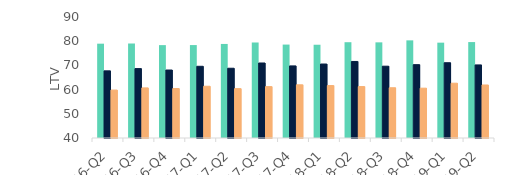
| Category | First-time
buyers | Homemovers | Homowner remortgaging |
|---|---|---|---|
| 16-Q2 | 78.977 | 67.747 | 59.804 |
| 16-Q3 | 79.048 | 68.681 | 60.7 |
| 16-Q4 | 78.38 | 68.092 | 60.436 |
| 17-Q1 | 78.403 | 69.634 | 61.389 |
| 17-Q2 | 78.863 | 68.828 | 60.401 |
| 17-Q3 | 79.466 | 70.996 | 61.234 |
| 17-Q4 | 78.605 | 69.785 | 61.983 |
| 18-Q1 | 78.539 | 70.566 | 61.675 |
| 18-Q2 | 79.584 | 71.628 | 61.254 |
| 18-Q3 | 79.526 | 69.671 | 60.766 |
| 18-Q4 | 80.349 | 70.303 | 60.584 |
| 19-Q1 | 79.398 | 71.103 | 62.64 |
| 19-Q2 | 79.64 | 70.195 | 61.91 |